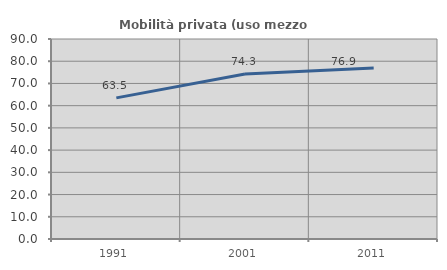
| Category | Mobilità privata (uso mezzo privato) |
|---|---|
| 1991.0 | 63.507 |
| 2001.0 | 74.295 |
| 2011.0 | 76.895 |